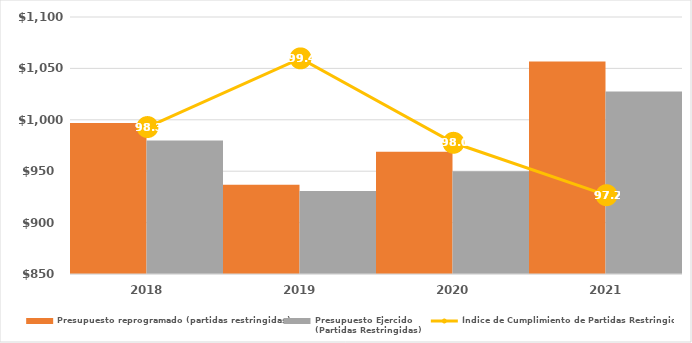
| Category | Presupuesto reprogramado (partidas restringidas) | Presupuesto Ejercido
(Partidas Restringidas) |
|---|---|---|
| 2018.0 | 996988 | 979910 |
| 2019.0 | 936775.686 | 930744.078 |
| 2020.0 | 968900.978 | 949931.095 |
| 2021.0 | 1056806.473 | 1027496.009 |